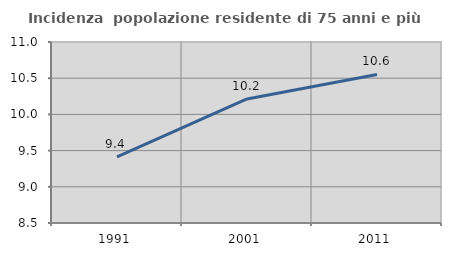
| Category | Incidenza  popolazione residente di 75 anni e più |
|---|---|
| 1991.0 | 9.414 |
| 2001.0 | 10.213 |
| 2011.0 | 10.552 |